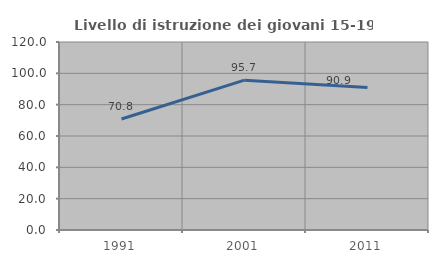
| Category | Livello di istruzione dei giovani 15-19 anni |
|---|---|
| 1991.0 | 70.833 |
| 2001.0 | 95.652 |
| 2011.0 | 90.909 |